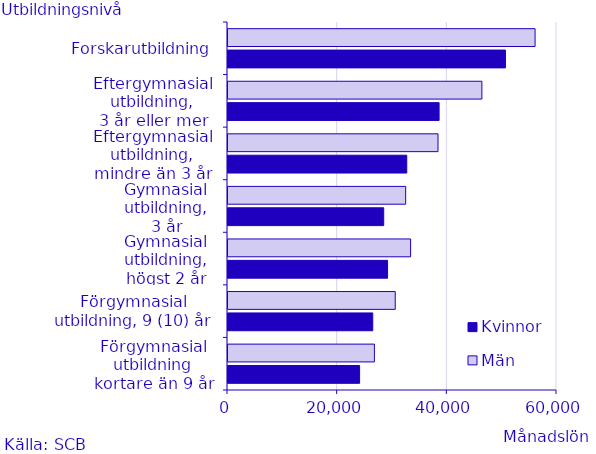
| Category | Kvinnor | Män |
|---|---|---|
| Förgymnasial utbildning
kortare än 9 år | 24000 | 26700 |
| Förgymnasial
utbildning, 9 (10) år | 26400 | 30500 |
| Gymnasial utbildning,
högst 2 år | 29100 | 33300 |
| Gymnasial utbildning,
3 år | 28400 | 32400 |
| Eftergymnasial utbildning,
mindre än 3 år | 32600 | 38300 |
| Eftergymnasial utbildning,
3 år eller mer | 38500 | 46300 |
| Forskarutbildning | 50600 | 56000 |